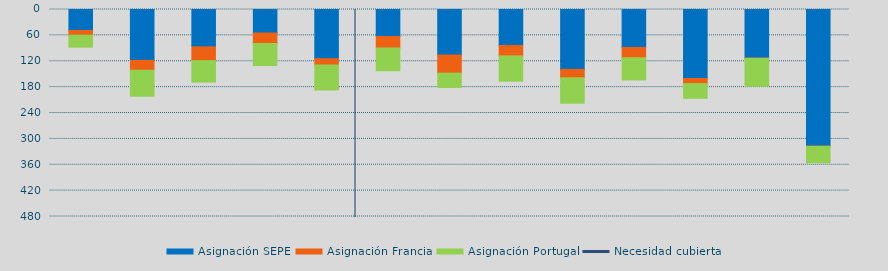
| Category | Asignación SEPE | Asignación Francia | Asignación Portugal |
|---|---|---|---|
| 0 | 48510.6 | 10931.6 | 27867.9 |
| 1 | 117881.4 | 22871.5 | 60380.5 |
| 2 | 86621.2 | 31842.2 | 49868.6 |
| 3 | 54505.3 | 24354.5 | 51005.7 |
| 4 | 114103.8 | 14504.8 | 58082.9 |
| 5 | 62612.7 | 26635.4 | 52718.7 |
| 6 | 105519.2 | 42049.8 | 33318.5 |
| 7 | 83466.2 | 24132.5 | 58650.9 |
| 8 | 138850.6 | 19527.1 | 58931.4 |
| 9 | 88000.9 | 23926.8 | 51284.5 |
| 10 | 159946.5 | 11873.6 | 33973.4 |
| 11 | 112774.35 | 263.2 | 64888 |
| 12 | 316845.45 | 348.4 | 37996.4 |